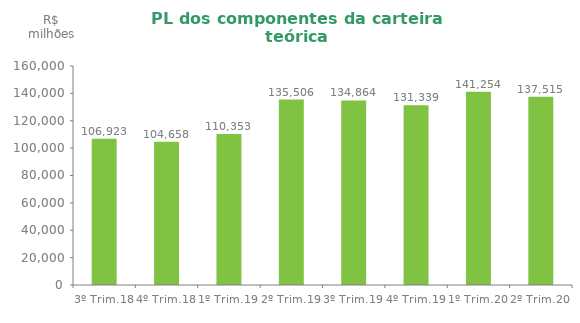
| Category | Series 0 |
|---|---|
| 3º Trim.18 | 106923.21 |
| 4º Trim.18 | 104658.138 |
| 1º Trim.19 | 110353.048 |
| 2º Trim.19 | 135505.78 |
| 3º Trim.19 | 134863.51 |
| 4º Trim.19 | 131338.794 |
| 1º Trim.20 | 141254.49 |
| 2º Trim.20 | 137515.45 |